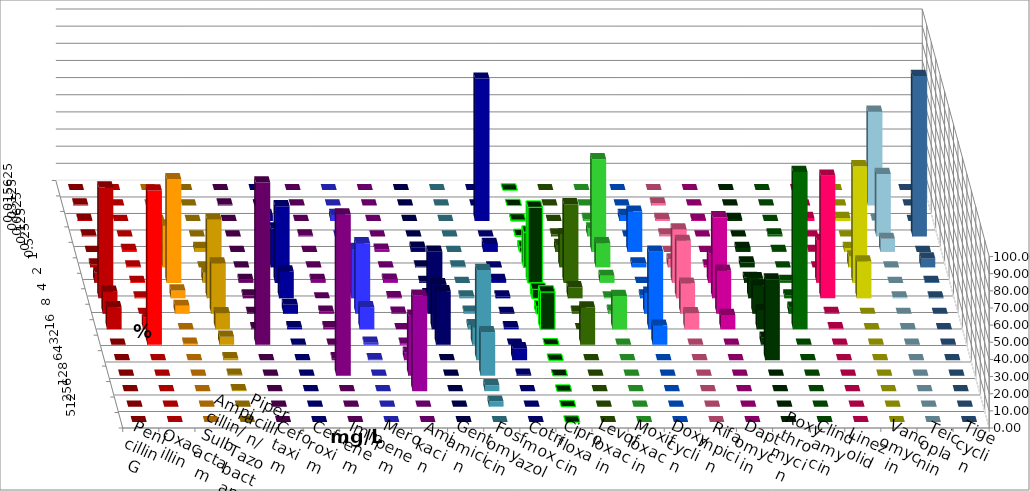
| Category | Penicillin G | Oxacillin | Ampicillin/ Sulbactam | Piperacillin/ Tazobactam | Cefotaxim | Cefuroxim | Imipenem | Meropenem | Amikacin | Gentamicin | Fosfomycin | Cotrimoxazol | Ciprofloxacin | Levofloxacin | Moxifloxacin | Doxycyclin | Rifampicin | Daptomycin | Roxythromycin | Clindamycin | Linezolid | Vancomycin | Teicoplanin | Tigecyclin |
|---|---|---|---|---|---|---|---|---|---|---|---|---|---|---|---|---|---|---|---|---|---|---|---|---|
| 0.015625 | 0 | 0 | 0 | 0 | 0 | 0 | 0 | 0 | 0 | 0 | 0 | 0 | 0 | 0 | 0 | 0 | 0 | 0 | 0 | 0 | 0 | 0 | 0 | 0 |
| 0.03125 | 0.588 | 0 | 0 | 0 | 0.588 | 0 | 0 | 0 | 0 | 0 | 0 | 0 | 0 | 0 | 0 | 0 | 1.176 | 0 | 0 | 0 | 0 | 0 | 0 | 54.706 |
| 0.0625 | 0.588 | 0 | 0 | 0 | 0 | 0 | 3.488 | 3.529 | 0 | 0 | 0 | 83.041 | 0.588 | 0 | 1.176 | 3.529 | 1.176 | 0.599 | 1.176 | 0 | 1.744 | 1.744 | 0 | 0.588 |
| 0.125 | 0.588 | 0 | 4.07 | 0 | 0 | 0.588 | 0 | 0 | 0 | 0 | 0 | 0 | 0.588 | 1.176 | 4.706 | 0 | 1.176 | 0 | 0 | 1.176 | 0 | 0 | 93.567 | 36.471 |
| 0.25 | 0 | 1.176 | 1.163 | 2.353 | 0 | 0 | 6.977 | 1.176 | 1.25 | 2.454 | 0 | 4.678 | 2.941 | 4.118 | 54.118 | 23.529 | 0 | 0 | 2.353 | 0.588 | 0.581 | 2.326 | 0 | 7.647 |
| 0.5 | 1.765 | 0.588 | 24.419 | 0 | 0 | 0 | 22.674 | 3.529 | 0 | 0.613 | 0.592 | 0 | 20.588 | 19.412 | 14.118 | 2.353 | 4.706 | 1.198 | 2.941 | 0 | 0 | 6.395 | 5.263 | 0 |
| 1.0 | 5.882 | 0.588 | 60.465 | 5.882 | 1.765 | 1.765 | 44.767 | 7.059 | 1.875 | 0.613 | 0 | 1.754 | 44.118 | 45.882 | 4.118 | 0 | 31.176 | 17.365 | 2.941 | 1.176 | 25 | 68.023 | 0.585 | 0 |
| 2.0 | 64.706 | 0.588 | 4.651 | 45.882 | 1.765 | 0 | 15.698 | 28.824 | 0.625 | 2.454 | 1.183 | 1.17 | 5.294 | 6.471 | 0.588 | 1.765 | 33.529 | 47.305 | 11.765 | 1.765 | 71.512 | 21.512 | 0.585 | 0.588 |
| 4.0 | 12.941 | 0 | 4.651 | 29.412 | 0.588 | 1.176 | 5.233 | 41.176 | 0.625 | 36.196 | 1.183 | 0.585 | 4.118 | 1.176 | 1.765 | 12.353 | 17.647 | 25.15 | 16.471 | 3.529 | 0.581 | 0 | 0 | 0 |
| 8.0 | 12.941 | 7.059 | 0 | 9.412 | 0.588 | 1.176 | 1.163 | 12.941 | 0 | 26.38 | 2.367 | 1.17 | 21.765 | 0 | 19.412 | 45.294 | 9.412 | 8.383 | 11.176 | 91.765 | 0.581 | 0 | 0 | 0 |
| 16.0 | 0 | 90 | 0.581 | 4.706 | 94.706 | 0 | 0 | 1.176 | 0.625 | 31.288 | 10.059 | 0 | 0 | 21.765 | 0 | 11.176 | 0 | 0 | 4.118 | 0 | 0 | 0 | 0 | 0 |
| 32.0 | 0 | 0 | 0 | 1.176 | 0 | 1.176 | 0 | 0.588 | 4.375 | 0 | 52.663 | 7.018 | 0 | 0 | 0 | 0 | 0 | 0 | 47.059 | 0 | 0 | 0 | 0 | 0 |
| 64.0 | 0 | 0 | 0 | 0.588 | 0 | 94.118 | 0 | 0 | 35 | 0 | 25.444 | 0.585 | 0 | 0 | 0 | 0 | 0 | 0 | 0 | 0 | 0 | 0 | 0 | 0 |
| 128.0 | 0 | 0 | 0 | 0.588 | 0 | 0 | 0 | 0 | 55.625 | 0 | 3.55 | 0 | 0 | 0 | 0 | 0 | 0 | 0 | 0 | 0 | 0 | 0 | 0 | 0 |
| 256.0 | 0 | 0 | 0 | 0 | 0 | 0 | 0 | 0 | 0 | 0 | 2.959 | 0 | 0 | 0 | 0 | 0 | 0 | 0 | 0 | 0 | 0 | 0 | 0 | 0 |
| 512.0 | 0 | 0 | 0 | 0 | 0 | 0 | 0 | 0 | 0 | 0 | 0 | 0 | 0 | 0 | 0 | 0 | 0 | 0 | 0 | 0 | 0 | 0 | 0 | 0 |